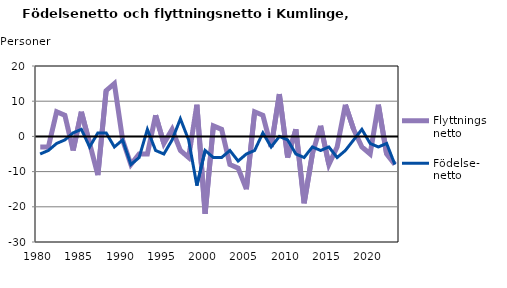
| Category | Flyttnings- netto | Födelse- netto |
|---|---|---|
| 1980.0 | -3 | -5 |
| 1981.0 | -3 | -4 |
| 1982.0 | 7 | -2 |
| 1983.0 | 6 | -1 |
| 1984.0 | -4 | 1 |
| 1985.0 | 7 | 2 |
| 1986.0 | -2 | -3 |
| 1987.0 | -11 | 1 |
| 1988.0 | 13 | 1 |
| 1989.0 | 15 | -3 |
| 1990.0 | -1 | -1 |
| 1991.0 | -8 | -8 |
| 1992.0 | -5 | -6 |
| 1993.0 | -5 | 2 |
| 1994.0 | 6 | -4 |
| 1995.0 | -2 | -5 |
| 1996.0 | 2 | -1 |
| 1997.0 | -4 | 5 |
| 1998.0 | -6 | -1 |
| 1999.0 | 9 | -14 |
| 2000.0 | -22 | -4 |
| 2001.0 | 3 | -6 |
| 2002.0 | 2 | -6 |
| 2003.0 | -8 | -4 |
| 2004.0 | -9 | -7 |
| 2005.0 | -15 | -5 |
| 2006.0 | 7 | -4 |
| 2007.0 | 6 | 1 |
| 2008.0 | -3 | -3 |
| 2009.0 | 12 | 0 |
| 2010.0 | -6 | -1 |
| 2011.0 | 2 | -5 |
| 2012.0 | -19 | -6 |
| 2013.0 | -5 | -3 |
| 2014.0 | 3 | -4 |
| 2015.0 | -8 | -3 |
| 2016.0 | -3 | -6 |
| 2017.0 | 9 | -4 |
| 2018.0 | 2 | -1 |
| 2019.0 | -3 | 2 |
| 2020.0 | -5 | -2 |
| 2021.0 | 9 | -3 |
| 2022.0 | -5 | -2 |
| 2023.0 | -8 | -8 |